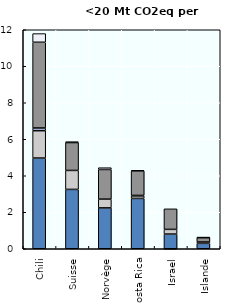
| Category | Fermentation entérique (CH4) | Gestion du fumier (CH4, N2O) | Riziculture (CH4) | Sol agricole (N2O) | Autres (CO2, CH4, N2O) |
|---|---|---|---|---|---|
| Chili | 4.971 | 1.498 | 0.149 | 4.697 | 0.475 |
| Suisse | 3.252 | 1.04 | 0 | 1.527 | 0.045 |
| Norvège | 2.24 | 0.48 | 0 | 1.624 | 0.098 |
| Costa Rica | 2.759 | 0.139 | 0.025 | 1.346 | 0.021 |
| Israel | 0.806 | 0.256 | 0 | 1.126 | 0 |
| Islande | 0.297 | 0.074 | 0 | 0.242 | 0.006 |